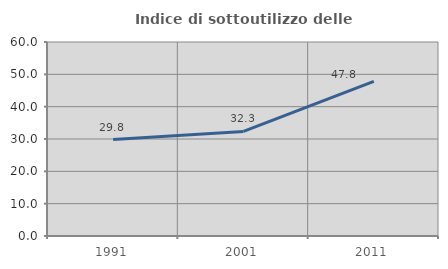
| Category | Indice di sottoutilizzo delle abitazioni  |
|---|---|
| 1991.0 | 29.836 |
| 2001.0 | 32.344 |
| 2011.0 | 47.838 |